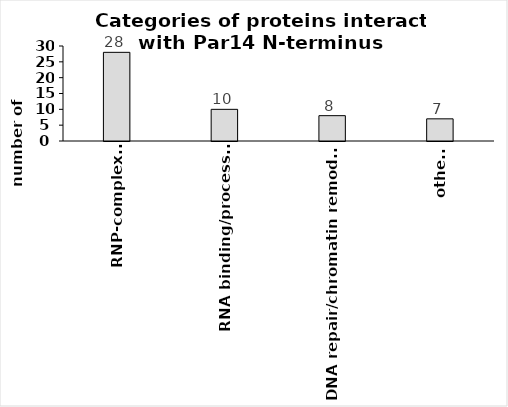
| Category | RNP-complexes |
|---|---|
| RNP-complexes | 28 |
| RNA binding/processing  | 10 |
| DNA repair/chromatin remodelling | 8 |
| others | 7 |